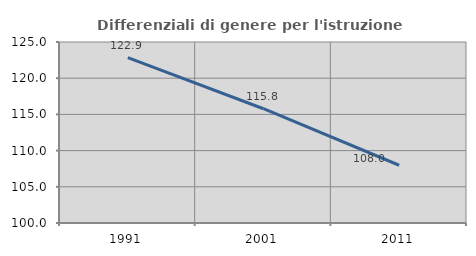
| Category | Differenziali di genere per l'istruzione superiore |
|---|---|
| 1991.0 | 122.854 |
| 2001.0 | 115.783 |
| 2011.0 | 107.978 |